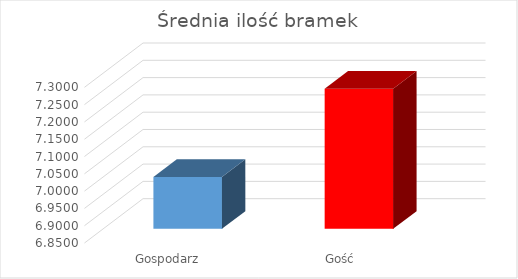
| Category | Series 0 |
|---|---|
| Gospodarz | 7 |
| Gość | 7.255 |